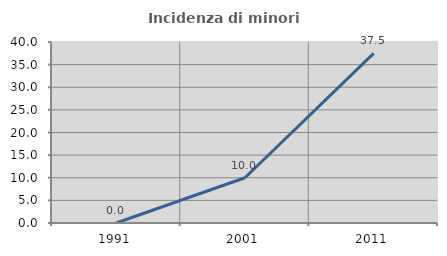
| Category | Incidenza di minori stranieri |
|---|---|
| 1991.0 | 0 |
| 2001.0 | 10 |
| 2011.0 | 37.5 |